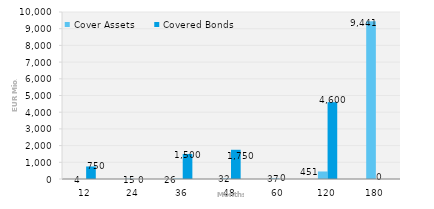
| Category | Cover Assets | Covered Bonds |
|---|---|---|
| 12.0 | 4.496 | 750 |
| 24.0 | 14.704 | 0 |
| 36.0 | 25.577 | 1500 |
| 48.0 | 31.987 | 1750 |
| 60.0 | 36.94 | 0 |
| 120.0 | 450.599 | 4600 |
| 180.0 | 9440.95 | 0 |